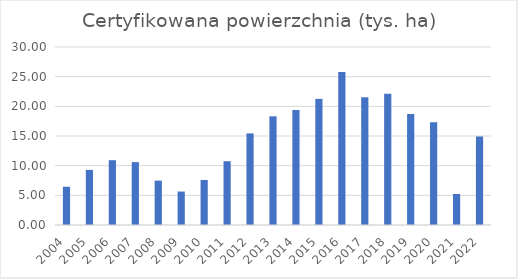
| Category | Certyfikowana powierzchnia (tys. ha) |
|---|---|
| 2004.0 | 6.45 |
| 2005.0 | 9.29 |
| 2006.0 | 10.92 |
| 2007.0 | 10.6 |
| 2008.0 | 7.48 |
| 2009.0 | 5.64 |
| 2010.0 | 7.59 |
| 2011.0 | 10.75 |
| 2012.0 | 15.44 |
| 2013.0 | 18.317 |
| 2014.0 | 19.38 |
| 2015.0 | 21.254 |
| 2016.0 | 25.768 |
| 2017.0 | 21.525 |
| 2018.0 | 22.119 |
| 2019.0 | 18.71 |
| 2020.0 | 17.32 |
| 2021.0 | 5.228 |
| 2022.0 | 14.924 |